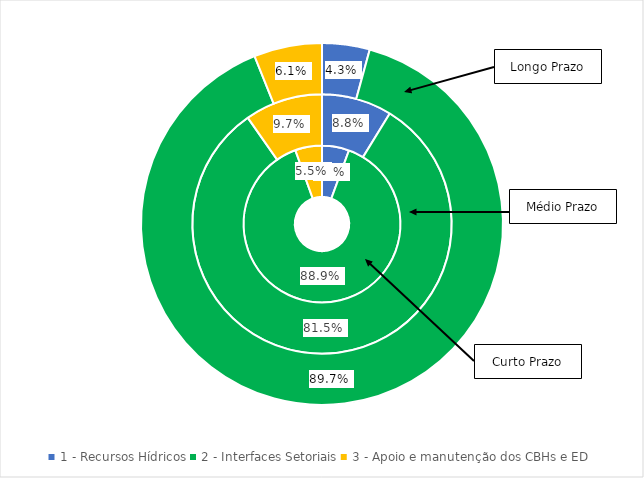
| Category | Curto Prazo (%) | Médio Prazo (%) | Longo Prazo (%) |
|---|---|---|---|
| 1 - Recursos Hídricos | 0.056 | 0.088 | 0.043 |
| 2 - Interfaces Setoriais | 0.889 | 0.815 | 0.897 |
| 3 - Apoio e manutenção dos CBHs e ED | 0.055 | 0.097 | 0.061 |